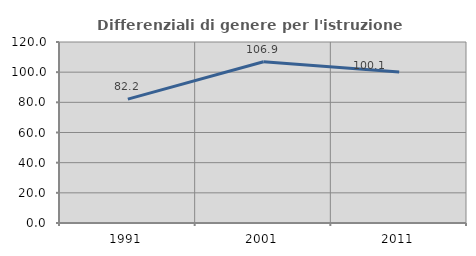
| Category | Differenziali di genere per l'istruzione superiore |
|---|---|
| 1991.0 | 82.151 |
| 2001.0 | 106.894 |
| 2011.0 | 100.075 |